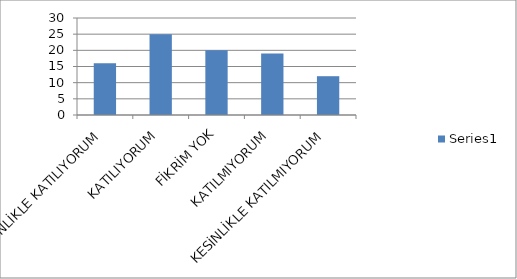
| Category | Series 0 |
|---|---|
| KESİNLİKLE KATILIYORUM | 16 |
| KATILIYORUM | 25 |
| FİKRİM YOK | 20 |
| KATILMIYORUM | 19 |
| KESİNLİKLE KATILMIYORUM | 12 |